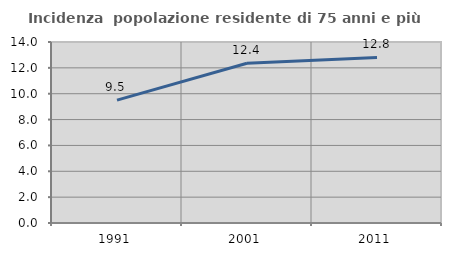
| Category | Incidenza  popolazione residente di 75 anni e più |
|---|---|
| 1991.0 | 9.501 |
| 2001.0 | 12.354 |
| 2011.0 | 12.803 |